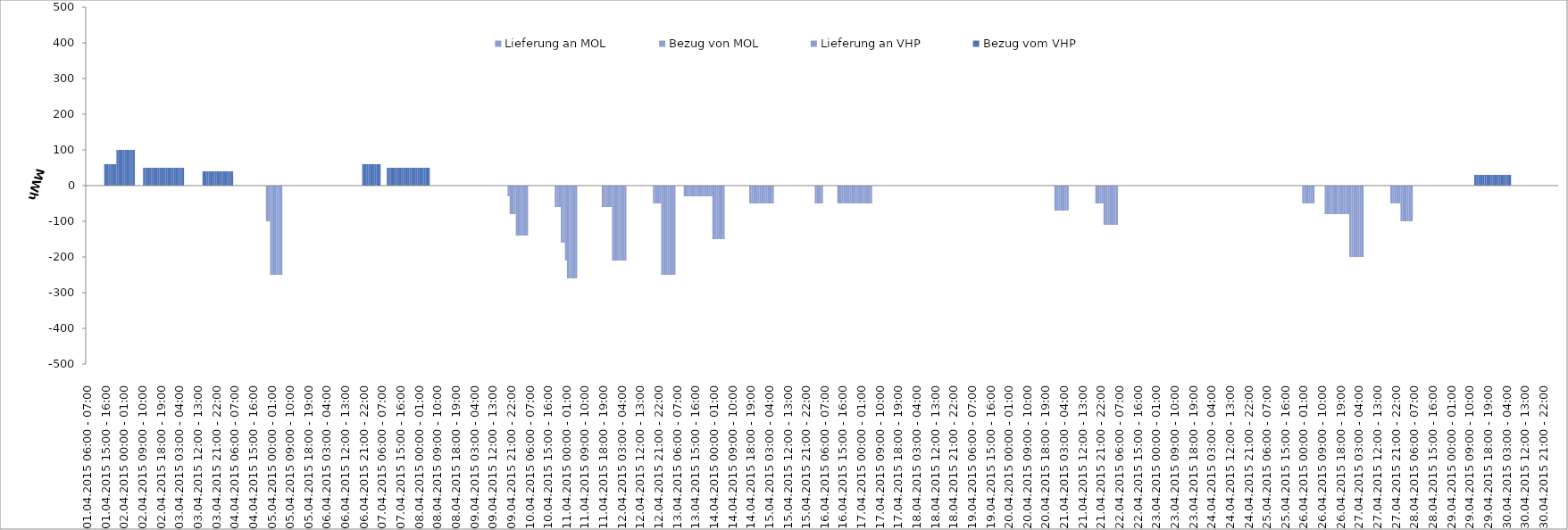
| Category | Bezug vom VHP | Lieferung an VHP | Bezug von MOL | Lieferung an MOL |
|---|---|---|---|---|
| 01.04.2015 06:00 - 07:00 | 0 | 0 | 0 | 0 |
| 01.04.2015 07:00 - 08:00 | 0 | 0 | 0 | 0 |
| 01.04.2015 08:00 - 09:00 | 0 | 0 | 0 | 0 |
| 01.04.2015 09:00 - 10:00 | 0 | 0 | 0 | 0 |
| 01.04.2015 10:00 - 11:00 | 0 | 0 | 0 | 0 |
| 01.04.2015 11:00 - 12:00 | 0 | 0 | 0 | 0 |
| 01.04.2015 12:00 - 13:00 | 0 | 0 | 0 | 0 |
| 01.04.2015 13:00 - 14:00 | 0 | 0 | 0 | 0 |
| 01.04.2015 14:00 - 15:00 | 0 | 0 | 0 | 0 |
| 01.04.2015 15:00 - 16:00 | 60 | 0 | 0 | 0 |
| 01.04.2015 16:00 - 17:00 | 60 | 0 | 0 | 0 |
| 01.04.2015 17:00 - 18:00 | 60 | 0 | 0 | 0 |
| 01.04.2015 18:00 - 19:00 | 60 | 0 | 0 | 0 |
| 01.04.2015 19:00 - 20:00 | 60 | 0 | 0 | 0 |
| 01.04.2015 20:00 - 21:00 | 60 | 0 | 0 | 0 |
| 01.04.2015 21:00 - 22:00 | 100 | 0 | 0 | 0 |
| 01.04.2015 22:00 - 23:00 | 100 | 0 | 0 | 0 |
| 01.04.2015 23:00 - 24:00 | 100 | 0 | 0 | 0 |
| 02.04.2015 00:00 - 01:00 | 100 | 0 | 0 | 0 |
| 02.04.2015 01:00 - 02:00 | 100 | 0 | 0 | 0 |
| 02.04.2015 02:00 - 03:00 | 100 | 0 | 0 | 0 |
| 02.04.2015 03:00 - 04:00 | 100 | 0 | 0 | 0 |
| 02.04.2015 04:00 - 05:00 | 100 | 0 | 0 | 0 |
| 02.04.2015 05:00 - 06:00 | 100 | 0 | 0 | 0 |
| 02.04.2015 06:00 - 07:00 | 0 | 0 | 0 | 0 |
| 02.04.2015 07:00 - 08:00 | 0 | 0 | 0 | 0 |
| 02.04.2015 08:00 - 09:00 | 0 | 0 | 0 | 0 |
| 02.04.2015 09:00 - 10:00 | 0 | 0 | 0 | 0 |
| 02.04.2015 10:00 - 11:00 | 50 | 0 | 0 | 0 |
| 02.04.2015 11:00 - 12:00 | 50 | 0 | 0 | 0 |
| 02.04.2015 12:00 - 13:00 | 50 | 0 | 0 | 0 |
| 02.04.2015 13:00 - 14:00 | 50 | 0 | 0 | 0 |
| 02.04.2015 14:00 - 15:00 | 50 | 0 | 0 | 0 |
| 02.04.2015 15:00 - 16:00 | 50 | 0 | 0 | 0 |
| 02.04.2015 16:00 - 17:00 | 50 | 0 | 0 | 0 |
| 02.04.2015 17:00 - 18:00 | 50 | 0 | 0 | 0 |
| 02.04.2015 18:00 - 19:00 | 50 | 0 | 0 | 0 |
| 02.04.2015 19:00 - 20:00 | 50 | 0 | 0 | 0 |
| 02.04.2015 20:00 - 21:00 | 50 | 0 | 0 | 0 |
| 02.04.2015 21:00 - 22:00 | 50 | 0 | 0 | 0 |
| 02.04.2015 22:00 - 23:00 | 50 | 0 | 0 | 0 |
| 02.04.2015 23:00 - 24:00 | 50 | 0 | 0 | 0 |
| 03.04.2015 00:00 - 01:00 | 50 | 0 | 0 | 0 |
| 03.04.2015 01:00 - 02:00 | 50 | 0 | 0 | 0 |
| 03.04.2015 02:00 - 03:00 | 50 | 0 | 0 | 0 |
| 03.04.2015 03:00 - 04:00 | 50 | 0 | 0 | 0 |
| 03.04.2015 04:00 - 05:00 | 50 | 0 | 0 | 0 |
| 03.04.2015 05:00 - 06:00 | 50 | 0 | 0 | 0 |
| 03.04.2015 06:00 - 07:00 | 0 | 0 | 0 | 0 |
| 03.04.2015 07:00 - 08:00 | 0 | 0 | 0 | 0 |
| 03.04.2015 08:00 - 09:00 | 0 | 0 | 0 | 0 |
| 03.04.2015 09:00 - 10:00 | 0 | 0 | 0 | 0 |
| 03.04.2015 10:00 - 11:00 | 0 | 0 | 0 | 0 |
| 03.04.2015 11:00 - 12:00 | 0 | 0 | 0 | 0 |
| 03.04.2015 12:00 - 13:00 | 0 | 0 | 0 | 0 |
| 03.04.2015 13:00 - 14:00 | 0 | 0 | 0 | 0 |
| 03.04.2015 14:00 - 15:00 | 0 | 0 | 0 | 0 |
| 03.04.2015 15:00 - 16:00 | 40 | 0 | 0 | 0 |
| 03.04.2015 16:00 - 17:00 | 40 | 0 | 0 | 0 |
| 03.04.2015 17:00 - 18:00 | 40 | 0 | 0 | 0 |
| 03.04.2015 18:00 - 19:00 | 40 | 0 | 0 | 0 |
| 03.04.2015 19:00 - 20:00 | 40 | 0 | 0 | 0 |
| 03.04.2015 20:00 - 21:00 | 40 | 0 | 0 | 0 |
| 03.04.2015 21:00 - 22:00 | 40 | 0 | 0 | 0 |
| 03.04.2015 22:00 - 23:00 | 40 | 0 | 0 | 0 |
| 03.04.2015 23:00 - 24:00 | 40 | 0 | 0 | 0 |
| 04.04.2015 00:00 - 01:00 | 40 | 0 | 0 | 0 |
| 04.04.2015 01:00 - 02:00 | 40 | 0 | 0 | 0 |
| 04.04.2015 02:00 - 03:00 | 40 | 0 | 0 | 0 |
| 04.04.2015 03:00 - 04:00 | 40 | 0 | 0 | 0 |
| 04.04.2015 04:00 - 05:00 | 40 | 0 | 0 | 0 |
| 04.04.2015 05:00 - 06:00 | 40 | 0 | 0 | 0 |
| 04.04.2015 06:00 - 07:00 | 0 | 0 | 0 | 0 |
| 04.04.2015 07:00 - 08:00 | 0 | 0 | 0 | 0 |
| 04.04.2015 08:00 - 09:00 | 0 | 0 | 0 | 0 |
| 04.04.2015 09:00 - 10:00 | 0 | 0 | 0 | 0 |
| 04.04.2015 10:00 - 11:00 | 0 | 0 | 0 | 0 |
| 04.04.2015 11:00 - 12:00 | 0 | 0 | 0 | 0 |
| 04.04.2015 12:00 - 13:00 | 0 | 0 | 0 | 0 |
| 04.04.2015 13:00 - 14:00 | 0 | 0 | 0 | 0 |
| 04.04.2015 14:00 - 15:00 | 0 | 0 | 0 | 0 |
| 04.04.2015 15:00 - 16:00 | 0 | 0 | 0 | 0 |
| 04.04.2015 16:00 - 17:00 | 0 | 0 | 0 | 0 |
| 04.04.2015 17:00 - 18:00 | 0 | 0 | 0 | 0 |
| 04.04.2015 18:00 - 19:00 | 0 | 0 | 0 | 0 |
| 04.04.2015 19:00 - 20:00 | 0 | 0 | 0 | 0 |
| 04.04.2015 20:00 - 21:00 | 0 | 0 | 0 | 0 |
| 04.04.2015 21:00 - 22:00 | 0 | 0 | 0 | 0 |
| 04.04.2015 22:00 - 23:00 | 0 | -100 | 0 | 0 |
| 04.04.2015 23:00 - 24:00 | 0 | -100 | 0 | 0 |
| 05.04.2015 00:00 - 01:00 | 0 | -250 | 0 | 0 |
| 05.04.2015 01:00 - 02:00 | 0 | -250 | 0 | 0 |
| 05.04.2015 02:00 - 03:00 | 0 | -250 | 0 | 0 |
| 05.04.2015 03:00 - 04:00 | 0 | -250 | 0 | 0 |
| 05.04.2015 04:00 - 05:00 | 0 | -250 | 0 | 0 |
| 05.04.2015 05:00 - 06:00 | 0 | -250 | 0 | 0 |
| 05.04.2015 06:00 - 07:00 | 0 | 0 | 0 | 0 |
| 05.04.2015 07:00 - 08:00 | 0 | 0 | 0 | 0 |
| 05.04.2015 08:00 - 09:00 | 0 | 0 | 0 | 0 |
| 05.04.2015 09:00 - 10:00 | 0 | 0 | 0 | 0 |
| 05.04.2015 10:00 - 11:00 | 0 | 0 | 0 | 0 |
| 05.04.2015 11:00 - 12:00 | 0 | 0 | 0 | 0 |
| 05.04.2015 12:00 - 13:00 | 0 | 0 | 0 | 0 |
| 05.04.2015 13:00 - 14:00 | 0 | 0 | 0 | 0 |
| 05.04.2015 14:00 - 15:00 | 0 | 0 | 0 | 0 |
| 05.04.2015 15:00 - 16:00 | 0 | 0 | 0 | 0 |
| 05.04.2015 16:00 - 17:00 | 0 | 0 | 0 | 0 |
| 05.04.2015 17:00 - 18:00 | 0 | 0 | 0 | 0 |
| 05.04.2015 18:00 - 19:00 | 0 | 0 | 0 | 0 |
| 05.04.2015 19:00 - 20:00 | 0 | 0 | 0 | 0 |
| 05.04.2015 20:00 - 21:00 | 0 | 0 | 0 | 0 |
| 05.04.2015 21:00 - 22:00 | 0 | 0 | 0 | 0 |
| 05.04.2015 22:00 - 23:00 | 0 | 0 | 0 | 0 |
| 05.04.2015 23:00 - 24:00 | 0 | 0 | 0 | 0 |
| 06.04.2015 00:00 - 01:00 | 0 | 0 | 0 | 0 |
| 06.04.2015 01:00 - 02:00 | 0 | 0 | 0 | 0 |
| 06.04.2015 02:00 - 03:00 | 0 | 0 | 0 | 0 |
| 06.04.2015 03:00 - 04:00 | 0 | 0 | 0 | 0 |
| 06.04.2015 04:00 - 05:00 | 0 | 0 | 0 | 0 |
| 06.04.2015 05:00 - 06:00 | 0 | 0 | 0 | 0 |
| 06.04.2015 06:00 - 07:00 | 0 | 0 | 0 | 0 |
| 06.04.2015 07:00 - 08:00 | 0 | 0 | 0 | 0 |
| 06.04.2015 08:00 - 09:00 | 0 | 0 | 0 | 0 |
| 06.04.2015 09:00 - 10:00 | 0 | 0 | 0 | 0 |
| 06.04.2015 10:00 - 11:00 | 0 | 0 | 0 | 0 |
| 06.04.2015 11:00 - 12:00 | 0 | 0 | 0 | 0 |
| 06.04.2015 12:00 - 13:00 | 0 | 0 | 0 | 0 |
| 06.04.2015 13:00 - 14:00 | 0 | 0 | 0 | 0 |
| 06.04.2015 14:00 - 15:00 | 0 | 0 | 0 | 0 |
| 06.04.2015 15:00 - 16:00 | 0 | 0 | 0 | 0 |
| 06.04.2015 16:00 - 17:00 | 0 | 0 | 0 | 0 |
| 06.04.2015 17:00 - 18:00 | 0 | 0 | 0 | 0 |
| 06.04.2015 18:00 - 19:00 | 0 | 0 | 0 | 0 |
| 06.04.2015 19:00 - 20:00 | 0 | 0 | 0 | 0 |
| 06.04.2015 20:00 - 21:00 | 0 | 0 | 0 | 0 |
| 06.04.2015 21:00 - 22:00 | 60 | 0 | 0 | 0 |
| 06.04.2015 22:00 - 23:00 | 60 | 0 | 0 | 0 |
| 06.04.2015 23:00 - 24:00 | 60 | 0 | 0 | 0 |
| 07.04.2015 00:00 - 01:00 | 60 | 0 | 0 | 0 |
| 07.04.2015 01:00 - 02:00 | 60 | 0 | 0 | 0 |
| 07.04.2015 02:00 - 03:00 | 60 | 0 | 0 | 0 |
| 07.04.2015 03:00 - 04:00 | 60 | 0 | 0 | 0 |
| 07.04.2015 04:00 - 05:00 | 60 | 0 | 0 | 0 |
| 07.04.2015 05:00 - 06:00 | 60 | 0 | 0 | 0 |
| 07.04.2015 06:00 - 07:00 | 0 | 0 | 0 | 0 |
| 07.04.2015 07:00 - 08:00 | 0 | 0 | 0 | 0 |
| 07.04.2015 08:00 - 09:00 | 0 | 0 | 0 | 0 |
| 07.04.2015 09:00 - 10:00 | 50 | 0 | 0 | 0 |
| 07.04.2015 10:00 - 11:00 | 50 | 0 | 0 | 0 |
| 07.04.2015 11:00 - 12:00 | 50 | 0 | 0 | 0 |
| 07.04.2015 12:00 - 13:00 | 50 | 0 | 0 | 0 |
| 07.04.2015 13:00 - 14:00 | 50 | 0 | 0 | 0 |
| 07.04.2015 14:00 - 15:00 | 50 | 0 | 0 | 0 |
| 07.04.2015 15:00 - 16:00 | 50 | 0 | 0 | 0 |
| 07.04.2015 16:00 - 17:00 | 50 | 0 | 0 | 0 |
| 07.04.2015 17:00 - 18:00 | 50 | 0 | 0 | 0 |
| 07.04.2015 18:00 - 19:00 | 50 | 0 | 0 | 0 |
| 07.04.2015 19:00 - 20:00 | 50 | 0 | 0 | 0 |
| 07.04.2015 20:00 - 21:00 | 50 | 0 | 0 | 0 |
| 07.04.2015 21:00 - 22:00 | 50 | 0 | 0 | 0 |
| 07.04.2015 22:00 - 23:00 | 50 | 0 | 0 | 0 |
| 07.04.2015 23:00 - 24:00 | 50 | 0 | 0 | 0 |
| 08.04.2015 00:00 - 01:00 | 50 | 0 | 0 | 0 |
| 08.04.2015 01:00 - 02:00 | 50 | 0 | 0 | 0 |
| 08.04.2015 02:00 - 03:00 | 50 | 0 | 0 | 0 |
| 08.04.2015 03:00 - 04:00 | 50 | 0 | 0 | 0 |
| 08.04.2015 04:00 - 05:00 | 50 | 0 | 0 | 0 |
| 08.04.2015 05:00 - 06:00 | 50 | 0 | 0 | 0 |
| 08.04.2015 06:00 - 07:00 | 0 | 0 | 0 | 0 |
| 08.04.2015 07:00 - 08:00 | 0 | 0 | 0 | 0 |
| 08.04.2015 08:00 - 09:00 | 0 | 0 | 0 | 0 |
| 08.04.2015 09:00 - 10:00 | 0 | 0 | 0 | 0 |
| 08.04.2015 10:00 - 11:00 | 0 | 0 | 0 | 0 |
| 08.04.2015 11:00 - 12:00 | 0 | 0 | 0 | 0 |
| 08.04.2015 12:00 - 13:00 | 0 | 0 | 0 | 0 |
| 08.04.2015 13:00 - 14:00 | 0 | 0 | 0 | 0 |
| 08.04.2015 14:00 - 15:00 | 0 | 0 | 0 | 0 |
| 08.04.2015 15:00 - 16:00 | 0 | 0 | 0 | 0 |
| 08.04.2015 16:00 - 17:00 | 0 | 0 | 0 | 0 |
| 08.04.2015 17:00 - 18:00 | 0 | 0 | 0 | 0 |
| 08.04.2015 18:00 - 19:00 | 0 | 0 | 0 | 0 |
| 08.04.2015 19:00 - 20:00 | 0 | 0 | 0 | 0 |
| 08.04.2015 20:00 - 21:00 | 0 | 0 | 0 | 0 |
| 08.04.2015 21:00 - 22:00 | 0 | 0 | 0 | 0 |
| 08.04.2015 22:00 - 23:00 | 0 | 0 | 0 | 0 |
| 08.04.2015 23:00 - 24:00 | 0 | 0 | 0 | 0 |
| 09.04.2015 00:00 - 01:00 | 0 | 0 | 0 | 0 |
| 09.04.2015 01:00 - 02:00 | 0 | 0 | 0 | 0 |
| 09.04.2015 02:00 - 03:00 | 0 | 0 | 0 | 0 |
| 09.04.2015 03:00 - 04:00 | 0 | 0 | 0 | 0 |
| 09.04.2015 04:00 - 05:00 | 0 | 0 | 0 | 0 |
| 09.04.2015 05:00 - 06:00 | 0 | 0 | 0 | 0 |
| 09.04.2015 06:00 - 07:00 | 0 | 0 | 0 | 0 |
| 09.04.2015 07:00 - 08:00 | 0 | 0 | 0 | 0 |
| 09.04.2015 08:00 - 09:00 | 0 | 0 | 0 | 0 |
| 09.04.2015 09:00 - 10:00 | 0 | 0 | 0 | 0 |
| 09.04.2015 10:00 - 11:00 | 0 | 0 | 0 | 0 |
| 09.04.2015 11:00 - 12:00 | 0 | 0 | 0 | 0 |
| 09.04.2015 12:00 - 13:00 | 0 | 0 | 0 | 0 |
| 09.04.2015 13:00 - 14:00 | 0 | 0 | 0 | 0 |
| 09.04.2015 14:00 - 15:00 | 0 | 0 | 0 | 0 |
| 09.04.2015 15:00 - 16:00 | 0 | 0 | 0 | 0 |
| 09.04.2015 16:00 - 17:00 | 0 | 0 | 0 | 0 |
| 09.04.2015 17:00 - 18:00 | 0 | 0 | 0 | 0 |
| 09.04.2015 18:00 - 19:00 | 0 | 0 | 0 | 0 |
| 09.04.2015 19:00 - 20:00 | 0 | 0 | 0 | 0 |
| 09.04.2015 20:00 - 21:00 | 0 | -30 | 0 | 0 |
| 09.04.2015 21:00 - 22:00 | 0 | -80 | 0 | 0 |
| 09.04.2015 22:00 - 23:00 | 0 | -80 | 0 | 0 |
| 09.04.2015 23:00 - 24:00 | 0 | -80 | 0 | 0 |
| 10.04.2015 00:00 - 01:00 | 0 | -140 | 0 | 0 |
| 10.04.2015 01:00 - 02:00 | 0 | -140 | 0 | 0 |
| 10.04.2015 02:00 - 03:00 | 0 | -140 | 0 | 0 |
| 10.04.2015 03:00 - 04:00 | 0 | -140 | 0 | 0 |
| 10.04.2015 04:00 - 05:00 | 0 | -140 | 0 | 0 |
| 10.04.2015 05:00 - 06:00 | 0 | -140 | 0 | 0 |
| 10.04.2015 06:00 - 07:00 | 0 | 0 | 0 | 0 |
| 10.04.2015 07:00 - 08:00 | 0 | 0 | 0 | 0 |
| 10.04.2015 08:00 - 09:00 | 0 | 0 | 0 | 0 |
| 10.04.2015 09:00 - 10:00 | 0 | 0 | 0 | 0 |
| 10.04.2015 10:00 - 11:00 | 0 | 0 | 0 | 0 |
| 10.04.2015 11:00 - 12:00 | 0 | 0 | 0 | 0 |
| 10.04.2015 12:00 - 13:00 | 0 | 0 | 0 | 0 |
| 10.04.2015 13:00 - 14:00 | 0 | 0 | 0 | 0 |
| 10.04.2015 14:00 - 15:00 | 0 | 0 | 0 | 0 |
| 10.04.2015 15:00 - 16:00 | 0 | 0 | 0 | 0 |
| 10.04.2015 16:00 - 17:00 | 0 | 0 | 0 | 0 |
| 10.04.2015 17:00 - 18:00 | 0 | 0 | 0 | 0 |
| 10.04.2015 18:00 - 19:00 | 0 | 0 | 0 | 0 |
| 10.04.2015 19:00 - 20:00 | 0 | -60 | 0 | 0 |
| 10.04.2015 20:00 - 21:00 | 0 | -60 | 0 | 0 |
| 10.04.2015 21:00 - 22:00 | 0 | -60 | 0 | 0 |
| 10.04.2015 22:00 - 23:00 | 0 | -160 | 0 | 0 |
| 10.04.2015 23:00 - 24:00 | 0 | -160 | 0 | 0 |
| 11.04.2015 00:00 - 01:00 | 0 | -210 | 0 | 0 |
| 11.04.2015 01:00 - 02:00 | 0 | -260 | 0 | 0 |
| 11.04.2015 02:00 - 03:00 | 0 | -260 | 0 | 0 |
| 11.04.2015 03:00 - 04:00 | 0 | -260 | 0 | 0 |
| 11.04.2015 04:00 - 05:00 | 0 | -260 | 0 | 0 |
| 11.04.2015 05:00 - 06:00 | 0 | -260 | 0 | 0 |
| 11.04.2015 06:00 - 07:00 | 0 | 0 | 0 | 0 |
| 11.04.2015 07:00 - 08:00 | 0 | 0 | 0 | 0 |
| 11.04.2015 08:00 - 09:00 | 0 | 0 | 0 | 0 |
| 11.04.2015 09:00 - 10:00 | 0 | 0 | 0 | 0 |
| 11.04.2015 10:00 - 11:00 | 0 | 0 | 0 | 0 |
| 11.04.2015 11:00 - 12:00 | 0 | 0 | 0 | 0 |
| 11.04.2015 12:00 - 13:00 | 0 | 0 | 0 | 0 |
| 11.04.2015 13:00 - 14:00 | 0 | 0 | 0 | 0 |
| 11.04.2015 14:00 - 15:00 | 0 | 0 | 0 | 0 |
| 11.04.2015 15:00 - 16:00 | 0 | 0 | 0 | 0 |
| 11.04.2015 16:00 - 17:00 | 0 | 0 | 0 | 0 |
| 11.04.2015 17:00 - 18:00 | 0 | 0 | 0 | 0 |
| 11.04.2015 18:00 - 19:00 | 0 | -60 | 0 | 0 |
| 11.04.2015 19:00 - 20:00 | 0 | -60 | 0 | 0 |
| 11.04.2015 20:00 - 21:00 | 0 | -60 | 0 | 0 |
| 11.04.2015 21:00 - 22:00 | 0 | -60 | 0 | 0 |
| 11.04.2015 22:00 - 23:00 | 0 | -60 | 0 | 0 |
| 11.04.2015 23:00 - 24:00 | 0 | -210 | 0 | 0 |
| 12.04.2015 00:00 - 01:00 | 0 | -210 | 0 | 0 |
| 12.04.2015 01:00 - 02:00 | 0 | -210 | 0 | 0 |
| 12.04.2015 02:00 - 03:00 | 0 | -210 | 0 | 0 |
| 12.04.2015 03:00 - 04:00 | 0 | -210 | 0 | 0 |
| 12.04.2015 04:00 - 05:00 | 0 | -210 | 0 | 0 |
| 12.04.2015 05:00 - 06:00 | 0 | -210 | 0 | 0 |
| 12.04.2015 06:00 - 07:00 | 0 | 0 | 0 | 0 |
| 12.04.2015 07:00 - 08:00 | 0 | 0 | 0 | 0 |
| 12.04.2015 08:00 - 09:00 | 0 | 0 | 0 | 0 |
| 12.04.2015 09:00 - 10:00 | 0 | 0 | 0 | 0 |
| 12.04.2015 10:00 - 11:00 | 0 | 0 | 0 | 0 |
| 12.04.2015 11:00 - 12:00 | 0 | 0 | 0 | 0 |
| 12.04.2015 12:00 - 13:00 | 0 | 0 | 0 | 0 |
| 12.04.2015 13:00 - 14:00 | 0 | 0 | 0 | 0 |
| 12.04.2015 14:00 - 15:00 | 0 | 0 | 0 | 0 |
| 12.04.2015 15:00 - 16:00 | 0 | 0 | 0 | 0 |
| 12.04.2015 16:00 - 17:00 | 0 | 0 | 0 | 0 |
| 12.04.2015 17:00 - 18:00 | 0 | 0 | 0 | 0 |
| 12.04.2015 18:00 - 19:00 | 0 | 0 | 0 | 0 |
| 12.04.2015 19:00 - 20:00 | 0 | -50 | 0 | 0 |
| 12.04.2015 20:00 - 21:00 | 0 | -50 | 0 | 0 |
| 12.04.2015 21:00 - 22:00 | 0 | -50 | 0 | 0 |
| 12.04.2015 22:00 - 23:00 | 0 | -50 | 0 | 0 |
| 12.04.2015 23:00 - 24:00 | 0 | -250 | 0 | 0 |
| 13.04.2015 00:00 - 01:00 | 0 | -250 | 0 | 0 |
| 13.04.2015 01:00 - 02:00 | 0 | -250 | 0 | 0 |
| 13.04.2015 02:00 - 03:00 | 0 | -250 | 0 | 0 |
| 13.04.2015 03:00 - 04:00 | 0 | -250 | 0 | 0 |
| 13.04.2015 04:00 - 05:00 | 0 | -250 | 0 | 0 |
| 13.04.2015 05:00 - 06:00 | 0 | -250 | 0 | 0 |
| 13.04.2015 06:00 - 07:00 | 0 | 0 | 0 | 0 |
| 13.04.2015 07:00 - 08:00 | 0 | 0 | 0 | 0 |
| 13.04.2015 08:00 - 09:00 | 0 | 0 | 0 | 0 |
| 13.04.2015 09:00 - 10:00 | 0 | 0 | 0 | 0 |
| 13.04.2015 10:00 - 11:00 | 0 | -30 | 0 | 0 |
| 13.04.2015 11:00 - 12:00 | 0 | -30 | 0 | 0 |
| 13.04.2015 12:00 - 13:00 | 0 | -30 | 0 | 0 |
| 13.04.2015 13:00 - 14:00 | 0 | -30 | 0 | 0 |
| 13.04.2015 14:00 - 15:00 | 0 | -30 | 0 | 0 |
| 13.04.2015 15:00 - 16:00 | 0 | -30 | 0 | 0 |
| 13.04.2015 16:00 - 17:00 | 0 | -30 | 0 | 0 |
| 13.04.2015 17:00 - 18:00 | 0 | -30 | 0 | 0 |
| 13.04.2015 18:00 - 19:00 | 0 | -30 | 0 | 0 |
| 13.04.2015 19:00 - 20:00 | 0 | -30 | 0 | 0 |
| 13.04.2015 20:00 - 21:00 | 0 | -30 | 0 | 0 |
| 13.04.2015 21:00 - 22:00 | 0 | -30 | 0 | 0 |
| 13.04.2015 22:00 - 23:00 | 0 | -30 | 0 | 0 |
| 13.04.2015 23:00 - 24:00 | 0 | -30 | 0 | 0 |
| 14.04.2015 00:00 - 01:00 | 0 | -150 | 0 | 0 |
| 14.04.2015 01:00 - 02:00 | 0 | -150 | 0 | 0 |
| 14.04.2015 02:00 - 03:00 | 0 | -150 | 0 | 0 |
| 14.04.2015 03:00 - 04:00 | 0 | -150 | 0 | 0 |
| 14.04.2015 04:00 - 05:00 | 0 | -150 | 0 | 0 |
| 14.04.2015 05:00 - 06:00 | 0 | -150 | 0 | 0 |
| 14.04.2015 06:00 - 07:00 | 0 | 0 | 0 | 0 |
| 14.04.2015 07:00 - 08:00 | 0 | 0 | 0 | 0 |
| 14.04.2015 08:00 - 09:00 | 0 | 0 | 0 | 0 |
| 14.04.2015 09:00 - 10:00 | 0 | 0 | 0 | 0 |
| 14.04.2015 10:00 - 11:00 | 0 | 0 | 0 | 0 |
| 14.04.2015 11:00 - 12:00 | 0 | 0 | 0 | 0 |
| 14.04.2015 12:00 - 13:00 | 0 | 0 | 0 | 0 |
| 14.04.2015 13:00 - 14:00 | 0 | 0 | 0 | 0 |
| 14.04.2015 14:00 - 15:00 | 0 | 0 | 0 | 0 |
| 14.04.2015 15:00 - 16:00 | 0 | 0 | 0 | 0 |
| 14.04.2015 16:00 - 17:00 | 0 | 0 | 0 | 0 |
| 14.04.2015 17:00 - 18:00 | 0 | 0 | 0 | 0 |
| 14.04.2015 18:00 - 19:00 | 0 | -50 | 0 | 0 |
| 14.04.2015 19:00 - 20:00 | 0 | -50 | 0 | 0 |
| 14.04.2015 20:00 - 21:00 | 0 | -50 | 0 | 0 |
| 14.04.2015 21:00 - 22:00 | 0 | -50 | 0 | 0 |
| 14.04.2015 22:00 - 23:00 | 0 | -50 | 0 | 0 |
| 14.04.2015 23:00 - 24:00 | 0 | -50 | 0 | 0 |
| 15.04.2015 00:00 - 01:00 | 0 | -50 | 0 | 0 |
| 15.04.2015 01:00 - 02:00 | 0 | -50 | 0 | 0 |
| 15.04.2015 02:00 - 03:00 | 0 | -50 | 0 | 0 |
| 15.04.2015 03:00 - 04:00 | 0 | -50 | 0 | 0 |
| 15.04.2015 04:00 - 05:00 | 0 | -50 | 0 | 0 |
| 15.04.2015 05:00 - 06:00 | 0 | -50 | 0 | 0 |
| 15.04.2015 06:00 - 07:00 | 0 | 0 | 0 | 0 |
| 15.04.2015 07:00 - 08:00 | 0 | 0 | 0 | 0 |
| 15.04.2015 08:00 - 09:00 | 0 | 0 | 0 | 0 |
| 15.04.2015 09:00 - 10:00 | 0 | 0 | 0 | 0 |
| 15.04.2015 10:00 - 11:00 | 0 | 0 | 0 | 0 |
| 15.04.2015 11:00 - 12:00 | 0 | 0 | 0 | 0 |
| 15.04.2015 12:00 - 13:00 | 0 | 0 | 0 | 0 |
| 15.04.2015 13:00 - 14:00 | 0 | 0 | 0 | 0 |
| 15.04.2015 14:00 - 15:00 | 0 | 0 | 0 | 0 |
| 15.04.2015 15:00 - 16:00 | 0 | 0 | 0 | 0 |
| 15.04.2015 16:00 - 17:00 | 0 | 0 | 0 | 0 |
| 15.04.2015 17:00 - 18:00 | 0 | 0 | 0 | 0 |
| 15.04.2015 18:00 - 19:00 | 0 | 0 | 0 | 0 |
| 15.04.2015 19:00 - 20:00 | 0 | 0 | 0 | 0 |
| 15.04.2015 20:00 - 21:00 | 0 | 0 | 0 | 0 |
| 15.04.2015 21:00 - 22:00 | 0 | 0 | 0 | 0 |
| 15.04.2015 22:00 - 23:00 | 0 | 0 | 0 | 0 |
| 15.04.2015 23:00 - 24:00 | 0 | 0 | 0 | 0 |
| 16.04.2015 00:00 - 01:00 | 0 | 0 | 0 | 0 |
| 16.04.2015 01:00 - 02:00 | 0 | 0 | 0 | 0 |
| 16.04.2015 02:00 - 03:00 | 0 | -50 | 0 | 0 |
| 16.04.2015 03:00 - 04:00 | 0 | -50 | 0 | 0 |
| 16.04.2015 04:00 - 05:00 | 0 | -50 | 0 | 0 |
| 16.04.2015 05:00 - 06:00 | 0 | -50 | 0 | 0 |
| 16.04.2015 06:00 - 07:00 | 0 | 0 | 0 | 0 |
| 16.04.2015 07:00 - 08:00 | 0 | 0 | 0 | 0 |
| 16.04.2015 08:00 - 09:00 | 0 | 0 | 0 | 0 |
| 16.04.2015 09:00 - 10:00 | 0 | 0 | 0 | 0 |
| 16.04.2015 10:00 - 11:00 | 0 | 0 | 0 | 0 |
| 16.04.2015 11:00 - 12:00 | 0 | 0 | 0 | 0 |
| 16.04.2015 12:00 - 13:00 | 0 | 0 | 0 | 0 |
| 16.04.2015 13:00 - 14:00 | 0 | -50 | 0 | 0 |
| 16.04.2015 14:00 - 15:00 | 0 | -50 | 0 | 0 |
| 16.04.2015 15:00 - 16:00 | 0 | -50 | 0 | 0 |
| 16.04.2015 16:00 - 17:00 | 0 | -50 | 0 | 0 |
| 16.04.2015 17:00 - 18:00 | 0 | -50 | 0 | 0 |
| 16.04.2015 18:00 - 19:00 | 0 | -50 | 0 | 0 |
| 16.04.2015 19:00 - 20:00 | 0 | -50 | 0 | 0 |
| 16.04.2015 20:00 - 21:00 | 0 | -50 | 0 | 0 |
| 16.04.2015 21:00 - 22:00 | 0 | -50 | 0 | 0 |
| 16.04.2015 22:00 - 23:00 | 0 | -50 | 0 | 0 |
| 16.04.2015 23:00 - 24:00 | 0 | -50 | 0 | 0 |
| 17.04.2015 00:00 - 01:00 | 0 | -50 | 0 | 0 |
| 17.04.2015 01:00 - 02:00 | 0 | -50 | 0 | 0 |
| 17.04.2015 02:00 - 03:00 | 0 | -50 | 0 | 0 |
| 17.04.2015 03:00 - 04:00 | 0 | -50 | 0 | 0 |
| 17.04.2015 04:00 - 05:00 | 0 | -50 | 0 | 0 |
| 17.04.2015 05:00 - 06:00 | 0 | -50 | 0 | 0 |
| 17.04.2015 06:00 - 07:00 | 0 | 0 | 0 | 0 |
| 17.04.2015 07:00 - 08:00 | 0 | 0 | 0 | 0 |
| 17.04.2015 08:00 - 09:00 | 0 | 0 | 0 | 0 |
| 17.04.2015 09:00 - 10:00 | 0 | 0 | 0 | 0 |
| 17.04.2015 10:00 - 11:00 | 0 | 0 | 0 | 0 |
| 17.04.2015 11:00 - 12:00 | 0 | 0 | 0 | 0 |
| 17.04.2015 12:00 - 13:00 | 0 | 0 | 0 | 0 |
| 17.04.2015 13:00 - 14:00 | 0 | 0 | 0 | 0 |
| 17.04.2015 14:00 - 15:00 | 0 | 0 | 0 | 0 |
| 17.04.2015 15:00 - 16:00 | 0 | 0 | 0 | 0 |
| 17.04.2015 16:00 - 17:00 | 0 | 0 | 0 | 0 |
| 17.04.2015 17:00 - 18:00 | 0 | 0 | 0 | 0 |
| 17.04.2015 18:00 - 19:00 | 0 | 0 | 0 | 0 |
| 17.04.2015 19:00 - 20:00 | 0 | 0 | 0 | 0 |
| 17.04.2015 20:00 - 21:00 | 0 | 0 | 0 | 0 |
| 17.04.2015 21:00 - 22:00 | 0 | 0 | 0 | 0 |
| 17.04.2015 22:00 - 23:00 | 0 | 0 | 0 | 0 |
| 17.04.2015 23:00 - 24:00 | 0 | 0 | 0 | 0 |
| 18.04.2015 00:00 - 01:00 | 0 | 0 | 0 | 0 |
| 18.04.2015 01:00 - 02:00 | 0 | 0 | 0 | 0 |
| 18.04.2015 02:00 - 03:00 | 0 | 0 | 0 | 0 |
| 18.04.2015 03:00 - 04:00 | 0 | 0 | 0 | 0 |
| 18.04.2015 04:00 - 05:00 | 0 | 0 | 0 | 0 |
| 18.04.2015 05:00 - 06:00 | 0 | 0 | 0 | 0 |
| 18.04.2015 06:00 - 07:00 | 0 | 0 | 0 | 0 |
| 18.04.2015 07:00 - 08:00 | 0 | 0 | 0 | 0 |
| 18.04.2015 08:00 - 09:00 | 0 | 0 | 0 | 0 |
| 18.04.2015 09:00 - 10:00 | 0 | 0 | 0 | 0 |
| 18.04.2015 10:00 - 11:00 | 0 | 0 | 0 | 0 |
| 18.04.2015 11:00 - 12:00 | 0 | 0 | 0 | 0 |
| 18.04.2015 12:00 - 13:00 | 0 | 0 | 0 | 0 |
| 18.04.2015 13:00 - 14:00 | 0 | 0 | 0 | 0 |
| 18.04.2015 14:00 - 15:00 | 0 | 0 | 0 | 0 |
| 18.04.2015 15:00 - 16:00 | 0 | 0 | 0 | 0 |
| 18.04.2015 16:00 - 17:00 | 0 | 0 | 0 | 0 |
| 18.04.2015 17:00 - 18:00 | 0 | 0 | 0 | 0 |
| 18.04.2015 18:00 - 19:00 | 0 | 0 | 0 | 0 |
| 18.04.2015 19:00 - 20:00 | 0 | 0 | 0 | 0 |
| 18.04.2015 20:00 - 21:00 | 0 | 0 | 0 | 0 |
| 18.04.2015 21:00 - 22:00 | 0 | 0 | 0 | 0 |
| 18.04.2015 22:00 - 23:00 | 0 | 0 | 0 | 0 |
| 18.04.2015 23:00 - 24:00 | 0 | 0 | 0 | 0 |
| 19.04.2015 00:00 - 01:00 | 0 | 0 | 0 | 0 |
| 19.04.2015 01:00 - 02:00 | 0 | 0 | 0 | 0 |
| 19.04.2015 02:00 - 03:00 | 0 | 0 | 0 | 0 |
| 19.04.2015 03:00 - 04:00 | 0 | 0 | 0 | 0 |
| 19.04.2015 04:00 - 05:00 | 0 | 0 | 0 | 0 |
| 19.04.2015 05:00 - 06:00 | 0 | 0 | 0 | 0 |
| 19.04.2015 06:00 - 07:00 | 0 | 0 | 0 | 0 |
| 19.04.2015 07:00 - 08:00 | 0 | 0 | 0 | 0 |
| 19.04.2015 08:00 - 09:00 | 0 | 0 | 0 | 0 |
| 19.04.2015 09:00 - 10:00 | 0 | 0 | 0 | 0 |
| 19.04.2015 10:00 - 11:00 | 0 | 0 | 0 | 0 |
| 19.04.2015 11:00 - 12:00 | 0 | 0 | 0 | 0 |
| 19.04.2015 12:00 - 13:00 | 0 | 0 | 0 | 0 |
| 19.04.2015 13:00 - 14:00 | 0 | 0 | 0 | 0 |
| 19.04.2015 14:00 - 15:00 | 0 | 0 | 0 | 0 |
| 19.04.2015 15:00 - 16:00 | 0 | 0 | 0 | 0 |
| 19.04.2015 16:00 - 17:00 | 0 | 0 | 0 | 0 |
| 19.04.2015 17:00 - 18:00 | 0 | 0 | 0 | 0 |
| 19.04.2015 18:00 - 19:00 | 0 | 0 | 0 | 0 |
| 19.04.2015 19:00 - 20:00 | 0 | 0 | 0 | 0 |
| 19.04.2015 20:00 - 21:00 | 0 | 0 | 0 | 0 |
| 19.04.2015 21:00 - 22:00 | 0 | 0 | 0 | 0 |
| 19.04.2015 22:00 - 23:00 | 0 | 0 | 0 | 0 |
| 19.04.2015 23:00 - 24:00 | 0 | 0 | 0 | 0 |
| 20.04.2015 00:00 - 01:00 | 0 | 0 | 0 | 0 |
| 20.04.2015 01:00 - 02:00 | 0 | 0 | 0 | 0 |
| 20.04.2015 02:00 - 03:00 | 0 | 0 | 0 | 0 |
| 20.04.2015 03:00 - 04:00 | 0 | 0 | 0 | 0 |
| 20.04.2015 04:00 - 05:00 | 0 | 0 | 0 | 0 |
| 20.04.2015 05:00 - 06:00 | 0 | 0 | 0 | 0 |
| 20.04.2015 06:00 - 07:00 | 0 | 0 | 0 | 0 |
| 20.04.2015 07:00 - 08:00 | 0 | 0 | 0 | 0 |
| 20.04.2015 08:00 - 09:00 | 0 | 0 | 0 | 0 |
| 20.04.2015 09:00 - 10:00 | 0 | 0 | 0 | 0 |
| 20.04.2015 10:00 - 11:00 | 0 | 0 | 0 | 0 |
| 20.04.2015 11:00 - 12:00 | 0 | 0 | 0 | 0 |
| 20.04.2015 12:00 - 13:00 | 0 | 0 | 0 | 0 |
| 20.04.2015 13:00 - 14:00 | 0 | 0 | 0 | 0 |
| 20.04.2015 14:00 - 15:00 | 0 | 0 | 0 | 0 |
| 20.04.2015 15:00 - 16:00 | 0 | 0 | 0 | 0 |
| 20.04.2015 16:00 - 17:00 | 0 | 0 | 0 | 0 |
| 20.04.2015 17:00 - 18:00 | 0 | 0 | 0 | 0 |
| 20.04.2015 18:00 - 19:00 | 0 | 0 | 0 | 0 |
| 20.04.2015 19:00 - 20:00 | 0 | 0 | 0 | 0 |
| 20.04.2015 20:00 - 21:00 | 0 | 0 | 0 | 0 |
| 20.04.2015 21:00 - 22:00 | 0 | 0 | 0 | 0 |
| 20.04.2015 22:00 - 23:00 | 0 | 0 | 0 | 0 |
| 20.04.2015 23:00 - 24:00 | 0 | -70 | 0 | 0 |
| 21.04.2015 00:00 - 01:00 | 0 | -70 | 0 | 0 |
| 21.04.2015 01:00 - 02:00 | 0 | -70 | 0 | 0 |
| 21.04.2015 02:00 - 03:00 | 0 | -70 | 0 | 0 |
| 21.04.2015 03:00 - 04:00 | 0 | -70 | 0 | 0 |
| 21.04.2015 04:00 - 05:00 | 0 | -70 | 0 | 0 |
| 21.04.2015 05:00 - 06:00 | 0 | -70 | 0 | 0 |
| 21.04.2015 06:00 - 07:00 | 0 | 0 | 0 | 0 |
| 21.04.2015 07:00 - 08:00 | 0 | 0 | 0 | 0 |
| 21.04.2015 08:00 - 09:00 | 0 | 0 | 0 | 0 |
| 21.04.2015 09:00 - 10:00 | 0 | 0 | 0 | 0 |
| 21.04.2015 10:00 - 11:00 | 0 | 0 | 0 | 0 |
| 21.04.2015 11:00 - 12:00 | 0 | 0 | 0 | 0 |
| 21.04.2015 12:00 - 13:00 | 0 | 0 | 0 | 0 |
| 21.04.2015 13:00 - 14:00 | 0 | 0 | 0 | 0 |
| 21.04.2015 14:00 - 15:00 | 0 | 0 | 0 | 0 |
| 21.04.2015 15:00 - 16:00 | 0 | 0 | 0 | 0 |
| 21.04.2015 16:00 - 17:00 | 0 | 0 | 0 | 0 |
| 21.04.2015 17:00 - 18:00 | 0 | 0 | 0 | 0 |
| 21.04.2015 18:00 - 19:00 | 0 | 0 | 0 | 0 |
| 21.04.2015 19:00 - 20:00 | 0 | -50 | 0 | 0 |
| 21.04.2015 20:00 - 21:00 | 0 | -50 | 0 | 0 |
| 21.04.2015 21:00 - 22:00 | 0 | -50 | 0 | 0 |
| 21.04.2015 22:00 - 23:00 | 0 | -50 | 0 | 0 |
| 21.04.2015 23:00 - 24:00 | 0 | -110 | 0 | 0 |
| 22.04.2015 00:00 - 01:00 | 0 | -110 | 0 | 0 |
| 22.04.2015 01:00 - 02:00 | 0 | -110 | 0 | 0 |
| 22.04.2015 02:00 - 03:00 | 0 | -110 | 0 | 0 |
| 22.04.2015 03:00 - 04:00 | 0 | -110 | 0 | 0 |
| 22.04.2015 04:00 - 05:00 | 0 | -110 | 0 | 0 |
| 22.04.2015 05:00 - 06:00 | 0 | -110 | 0 | 0 |
| 22.04.2015 06:00 - 07:00 | 0 | 0 | 0 | 0 |
| 22.04.2015 07:00 - 08:00 | 0 | 0 | 0 | 0 |
| 22.04.2015 08:00 - 09:00 | 0 | 0 | 0 | 0 |
| 22.04.2015 09:00 - 10:00 | 0 | 0 | 0 | 0 |
| 22.04.2015 10:00 - 11:00 | 0 | 0 | 0 | 0 |
| 22.04.2015 11:00 - 12:00 | 0 | 0 | 0 | 0 |
| 22.04.2015 12:00 - 13:00 | 0 | 0 | 0 | 0 |
| 22.04.2015 13:00 - 14:00 | 0 | 0 | 0 | 0 |
| 22.04.2015 14:00 - 15:00 | 0 | 0 | 0 | 0 |
| 22.04.2015 15:00 - 16:00 | 0 | 0 | 0 | 0 |
| 22.04.2015 16:00 - 17:00 | 0 | 0 | 0 | 0 |
| 22.04.2015 17:00 - 18:00 | 0 | 0 | 0 | 0 |
| 22.04.2015 18:00 - 19:00 | 0 | 0 | 0 | 0 |
| 22.04.2015 19:00 - 20:00 | 0 | 0 | 0 | 0 |
| 22.04.2015 20:00 - 21:00 | 0 | 0 | 0 | 0 |
| 22.04.2015 21:00 - 22:00 | 0 | 0 | 0 | 0 |
| 22.04.2015 22:00 - 23:00 | 0 | 0 | 0 | 0 |
| 22.04.2015 23:00 - 24:00 | 0 | 0 | 0 | 0 |
| 23.04.2015 00:00 - 01:00 | 0 | 0 | 0 | 0 |
| 23.04.2015 01:00 - 02:00 | 0 | 0 | 0 | 0 |
| 23.04.2015 02:00 - 03:00 | 0 | 0 | 0 | 0 |
| 23.04.2015 03:00 - 04:00 | 0 | 0 | 0 | 0 |
| 23.04.2015 04:00 - 05:00 | 0 | 0 | 0 | 0 |
| 23.04.2015 05:00 - 06:00 | 0 | 0 | 0 | 0 |
| 23.04.2015 06:00 - 07:00 | 0 | 0 | 0 | 0 |
| 23.04.2015 07:00 - 08:00 | 0 | 0 | 0 | 0 |
| 23.04.2015 08:00 - 09:00 | 0 | 0 | 0 | 0 |
| 23.04.2015 09:00 - 10:00 | 0 | 0 | 0 | 0 |
| 23.04.2015 10:00 - 11:00 | 0 | 0 | 0 | 0 |
| 23.04.2015 11:00 - 12:00 | 0 | 0 | 0 | 0 |
| 23.04.2015 12:00 - 13:00 | 0 | 0 | 0 | 0 |
| 23.04.2015 13:00 - 14:00 | 0 | 0 | 0 | 0 |
| 23.04.2015 14:00 - 15:00 | 0 | 0 | 0 | 0 |
| 23.04.2015 15:00 - 16:00 | 0 | 0 | 0 | 0 |
| 23.04.2015 16:00 - 17:00 | 0 | 0 | 0 | 0 |
| 23.04.2015 17:00 - 18:00 | 0 | 0 | 0 | 0 |
| 23.04.2015 18:00 - 19:00 | 0 | 0 | 0 | 0 |
| 23.04.2015 19:00 - 20:00 | 0 | 0 | 0 | 0 |
| 23.04.2015 20:00 - 21:00 | 0 | 0 | 0 | 0 |
| 23.04.2015 21:00 - 22:00 | 0 | 0 | 0 | 0 |
| 23.04.2015 22:00 - 23:00 | 0 | 0 | 0 | 0 |
| 23.04.2015 23:00 - 24:00 | 0 | 0 | 0 | 0 |
| 24.04.2015 00:00 - 01:00 | 0 | 0 | 0 | 0 |
| 24.04.2015 01:00 - 02:00 | 0 | 0 | 0 | 0 |
| 24.04.2015 02:00 - 03:00 | 0 | 0 | 0 | 0 |
| 24.04.2015 03:00 - 04:00 | 0 | 0 | 0 | 0 |
| 24.04.2015 04:00 - 05:00 | 0 | 0 | 0 | 0 |
| 24.04.2015 05:00 - 06:00 | 0 | 0 | 0 | 0 |
| 24.04.2015 06:00 - 07:00 | 0 | 0 | 0 | 0 |
| 24.04.2015 07:00 - 08:00 | 0 | 0 | 0 | 0 |
| 24.04.2015 08:00 - 09:00 | 0 | 0 | 0 | 0 |
| 24.04.2015 09:00 - 10:00 | 0 | 0 | 0 | 0 |
| 24.04.2015 10:00 - 11:00 | 0 | 0 | 0 | 0 |
| 24.04.2015 11:00 - 12:00 | 0 | 0 | 0 | 0 |
| 24.04.2015 12:00 - 13:00 | 0 | 0 | 0 | 0 |
| 24.04.2015 13:00 - 14:00 | 0 | 0 | 0 | 0 |
| 24.04.2015 14:00 - 15:00 | 0 | 0 | 0 | 0 |
| 24.04.2015 15:00 - 16:00 | 0 | 0 | 0 | 0 |
| 24.04.2015 16:00 - 17:00 | 0 | 0 | 0 | 0 |
| 24.04.2015 17:00 - 18:00 | 0 | 0 | 0 | 0 |
| 24.04.2015 18:00 - 19:00 | 0 | 0 | 0 | 0 |
| 24.04.2015 19:00 - 20:00 | 0 | 0 | 0 | 0 |
| 24.04.2015 20:00 - 21:00 | 0 | 0 | 0 | 0 |
| 24.04.2015 21:00 - 22:00 | 0 | 0 | 0 | 0 |
| 24.04.2015 22:00 - 23:00 | 0 | 0 | 0 | 0 |
| 24.04.2015 23:00 - 24:00 | 0 | 0 | 0 | 0 |
| 25.04.2015 00:00 - 01:00 | 0 | 0 | 0 | 0 |
| 25.04.2015 01:00 - 02:00 | 0 | 0 | 0 | 0 |
| 25.04.2015 02:00 - 03:00 | 0 | 0 | 0 | 0 |
| 25.04.2015 03:00 - 04:00 | 0 | 0 | 0 | 0 |
| 25.04.2015 04:00 - 05:00 | 0 | 0 | 0 | 0 |
| 25.04.2015 05:00 - 06:00 | 0 | 0 | 0 | 0 |
| 25.04.2015 06:00 - 07:00 | 0 | 0 | 0 | 0 |
| 25.04.2015 07:00 - 08:00 | 0 | 0 | 0 | 0 |
| 25.04.2015 08:00 - 09:00 | 0 | 0 | 0 | 0 |
| 25.04.2015 09:00 - 10:00 | 0 | 0 | 0 | 0 |
| 25.04.2015 10:00 - 11:00 | 0 | 0 | 0 | 0 |
| 25.04.2015 11:00 - 12:00 | 0 | 0 | 0 | 0 |
| 25.04.2015 12:00 - 13:00 | 0 | 0 | 0 | 0 |
| 25.04.2015 13:00 - 14:00 | 0 | 0 | 0 | 0 |
| 25.04.2015 14:00 - 15:00 | 0 | 0 | 0 | 0 |
| 25.04.2015 15:00 - 16:00 | 0 | 0 | 0 | 0 |
| 25.04.2015 16:00 - 17:00 | 0 | 0 | 0 | 0 |
| 25.04.2015 17:00 - 18:00 | 0 | 0 | 0 | 0 |
| 25.04.2015 18:00 - 19:00 | 0 | 0 | 0 | 0 |
| 25.04.2015 19:00 - 20:00 | 0 | 0 | 0 | 0 |
| 25.04.2015 20:00 - 21:00 | 0 | 0 | 0 | 0 |
| 25.04.2015 21:00 - 22:00 | 0 | 0 | 0 | 0 |
| 25.04.2015 22:00 - 23:00 | 0 | 0 | 0 | 0 |
| 25.04.2015 23:00 - 24:00 | 0 | 0 | 0 | 0 |
| 26.04.2015 00:00 - 01:00 | 0 | -50 | 0 | 0 |
| 26.04.2015 01:00 - 02:00 | 0 | -50 | 0 | 0 |
| 26.04.2015 02:00 - 03:00 | 0 | -50 | 0 | 0 |
| 26.04.2015 03:00 - 04:00 | 0 | -50 | 0 | 0 |
| 26.04.2015 04:00 - 05:00 | 0 | -50 | 0 | 0 |
| 26.04.2015 05:00 - 06:00 | 0 | -50 | 0 | 0 |
| 26.04.2015 06:00 - 07:00 | 0 | 0 | 0 | 0 |
| 26.04.2015 07:00 - 08:00 | 0 | 0 | 0 | 0 |
| 26.04.2015 08:00 - 09:00 | 0 | 0 | 0 | 0 |
| 26.04.2015 09:00 - 10:00 | 0 | 0 | 0 | 0 |
| 26.04.2015 10:00 - 11:00 | 0 | 0 | 0 | 0 |
| 26.04.2015 11:00 - 12:00 | 0 | -80 | 0 | 0 |
| 26.04.2015 12:00 - 13:00 | 0 | -80 | 0 | 0 |
| 26.04.2015 13:00 - 14:00 | 0 | -80 | 0 | 0 |
| 26.04.2015 14:00 - 15:00 | 0 | -80 | 0 | 0 |
| 26.04.2015 15:00 - 16:00 | 0 | -80 | 0 | 0 |
| 26.04.2015 16:00 - 17:00 | 0 | -80 | 0 | 0 |
| 26.04.2015 17:00 - 18:00 | 0 | -80 | 0 | 0 |
| 26.04.2015 18:00 - 19:00 | 0 | -80 | 0 | 0 |
| 26.04.2015 19:00 - 20:00 | 0 | -80 | 0 | 0 |
| 26.04.2015 20:00 - 21:00 | 0 | -80 | 0 | 0 |
| 26.04.2015 21:00 - 22:00 | 0 | -80 | 0 | 0 |
| 26.04.2015 22:00 - 23:00 | 0 | -80 | 0 | 0 |
| 26.04.2015 23:00 - 24:00 | 0 | -200 | 0 | 0 |
| 27.04.2015 00:00 - 01:00 | 0 | -200 | 0 | 0 |
| 27.04.2015 01:00 - 02:00 | 0 | -200 | 0 | 0 |
| 27.04.2015 02:00 - 03:00 | 0 | -200 | 0 | 0 |
| 27.04.2015 03:00 - 04:00 | 0 | -200 | 0 | 0 |
| 27.04.2015 04:00 - 05:00 | 0 | -200 | 0 | 0 |
| 27.04.2015 05:00 - 06:00 | 0 | -200 | 0 | 0 |
| 27.04.2015 06:00 - 07:00 | 0 | 0 | 0 | 0 |
| 27.04.2015 07:00 - 08:00 | 0 | 0 | 0 | 0 |
| 27.04.2015 08:00 - 09:00 | 0 | 0 | 0 | 0 |
| 27.04.2015 09:00 - 10:00 | 0 | 0 | 0 | 0 |
| 27.04.2015 10:00 - 11:00 | 0 | 0 | 0 | 0 |
| 27.04.2015 11:00 - 12:00 | 0 | 0 | 0 | 0 |
| 27.04.2015 12:00 - 13:00 | 0 | 0 | 0 | 0 |
| 27.04.2015 13:00 - 14:00 | 0 | 0 | 0 | 0 |
| 27.04.2015 14:00 - 15:00 | 0 | 0 | 0 | 0 |
| 27.04.2015 15:00 - 16:00 | 0 | 0 | 0 | 0 |
| 27.04.2015 16:00 - 17:00 | 0 | 0 | 0 | 0 |
| 27.04.2015 17:00 - 18:00 | 0 | 0 | 0 | 0 |
| 27.04.2015 18:00 - 19:00 | 0 | 0 | 0 | 0 |
| 27.04.2015 19:00 - 20:00 | 0 | -50 | 0 | 0 |
| 27.04.2015 20:00 - 21:00 | 0 | -50 | 0 | 0 |
| 27.04.2015 21:00 - 22:00 | 0 | -50 | 0 | 0 |
| 27.04.2015 22:00 - 23:00 | 0 | -50 | 0 | 0 |
| 27.04.2015 23:00 - 24:00 | 0 | -50 | 0 | 0 |
| 28.04.2015 00:00 - 01:00 | 0 | -100 | 0 | 0 |
| 28.04.2015 01:00 - 02:00 | 0 | -100 | 0 | 0 |
| 28.04.2015 02:00 - 03:00 | 0 | -100 | 0 | 0 |
| 28.04.2015 03:00 - 04:00 | 0 | -100 | 0 | 0 |
| 28.04.2015 04:00 - 05:00 | 0 | -100 | 0 | 0 |
| 28.04.2015 05:00 - 06:00 | 0 | -100 | 0 | 0 |
| 28.04.2015 06:00 - 07:00 | 0 | 0 | 0 | 0 |
| 28.04.2015 07:00 - 08:00 | 0 | 0 | 0 | 0 |
| 28.04.2015 08:00 - 09:00 | 0 | 0 | 0 | 0 |
| 28.04.2015 09:00 - 10:00 | 0 | 0 | 0 | 0 |
| 28.04.2015 10:00 - 11:00 | 0 | 0 | 0 | 0 |
| 28.04.2015 11:00 - 12:00 | 0 | 0 | 0 | 0 |
| 28.04.2015 12:00 - 13:00 | 0 | 0 | 0 | 0 |
| 28.04.2015 13:00 - 14:00 | 0 | 0 | 0 | 0 |
| 28.04.2015 14:00 - 15:00 | 0 | 0 | 0 | 0 |
| 28.04.2015 15:00 - 16:00 | 0 | 0 | 0 | 0 |
| 28.04.2015 16:00 - 17:00 | 0 | 0 | 0 | 0 |
| 28.04.2015 17:00 - 18:00 | 0 | 0 | 0 | 0 |
| 28.04.2015 18:00 - 19:00 | 0 | 0 | 0 | 0 |
| 28.04.2015 19:00 - 20:00 | 0 | 0 | 0 | 0 |
| 28.04.2015 20:00 - 21:00 | 0 | 0 | 0 | 0 |
| 28.04.2015 21:00 - 22:00 | 0 | 0 | 0 | 0 |
| 28.04.2015 22:00 - 23:00 | 0 | 0 | 0 | 0 |
| 28.04.2015 23:00 - 24:00 | 0 | 0 | 0 | 0 |
| 29.04.2015 00:00 - 01:00 | 0 | 0 | 0 | 0 |
| 29.04.2015 01:00 - 02:00 | 0 | 0 | 0 | 0 |
| 29.04.2015 02:00 - 03:00 | 0 | 0 | 0 | 0 |
| 29.04.2015 03:00 - 04:00 | 0 | 0 | 0 | 0 |
| 29.04.2015 04:00 - 05:00 | 0 | 0 | 0 | 0 |
| 29.04.2015 05:00 - 06:00 | 0 | 0 | 0 | 0 |
| 29.04.2015 06:00 - 07:00 | 0 | 0 | 0 | 0 |
| 29.04.2015 07:00 - 08:00 | 0 | 0 | 0 | 0 |
| 29.04.2015 08:00 - 09:00 | 0 | 0 | 0 | 0 |
| 29.04.2015 09:00 - 10:00 | 0 | 0 | 0 | 0 |
| 29.04.2015 10:00 - 11:00 | 0 | 0 | 0 | 0 |
| 29.04.2015 11:00 - 12:00 | 0 | 0 | 0 | 0 |
| 29.04.2015 12:00 - 13:00 | 30 | 0 | 0 | 0 |
| 29.04.2015 13:00 - 14:00 | 30 | 0 | 0 | 0 |
| 29.04.2015 14:00 - 15:00 | 30 | 0 | 0 | 0 |
| 29.04.2015 15:00 - 16:00 | 30 | 0 | 0 | 0 |
| 29.04.2015 16:00 - 17:00 | 30 | 0 | 0 | 0 |
| 29.04.2015 17:00 - 18:00 | 30 | 0 | 0 | 0 |
| 29.04.2015 18:00 - 19:00 | 30 | 0 | 0 | 0 |
| 29.04.2015 19:00 - 20:00 | 30 | 0 | 0 | 0 |
| 29.04.2015 20:00 - 21:00 | 30 | 0 | 0 | 0 |
| 29.04.2015 21:00 - 22:00 | 30 | 0 | 0 | 0 |
| 29.04.2015 22:00 - 23:00 | 30 | 0 | 0 | 0 |
| 29.04.2015 23:00 - 24:00 | 30 | 0 | 0 | 0 |
| 30.04.2015 00:00 - 01:00 | 30 | 0 | 0 | 0 |
| 30.04.2015 01:00 - 02:00 | 30 | 0 | 0 | 0 |
| 30.04.2015 02:00 - 03:00 | 30 | 0 | 0 | 0 |
| 30.04.2015 03:00 - 04:00 | 30 | 0 | 0 | 0 |
| 30.04.2015 04:00 - 05:00 | 30 | 0 | 0 | 0 |
| 30.04.2015 05:00 - 06:00 | 30 | 0 | 0 | 0 |
| 30.04.2015 06:00 - 07:00 | 0 | 0 | 0 | 0 |
| 30.04.2015 07:00 - 08:00 | 0 | 0 | 0 | 0 |
| 30.04.2015 08:00 - 09:00 | 0 | 0 | 0 | 0 |
| 30.04.2015 09:00 - 10:00 | 0 | 0 | 0 | 0 |
| 30.04.2015 10:00 - 11:00 | 0 | 0 | 0 | 0 |
| 30.04.2015 11:00 - 12:00 | 0 | 0 | 0 | 0 |
| 30.04.2015 12:00 - 13:00 | 0 | 0 | 0 | 0 |
| 30.04.2015 13:00 - 14:00 | 0 | 0 | 0 | 0 |
| 30.04.2015 14:00 - 15:00 | 0 | 0 | 0 | 0 |
| 30.04.2015 15:00 - 16:00 | 0 | 0 | 0 | 0 |
| 30.04.2015 16:00 - 17:00 | 0 | 0 | 0 | 0 |
| 30.04.2015 17:00 - 18:00 | 0 | 0 | 0 | 0 |
| 30.04.2015 18:00 - 19:00 | 0 | 0 | 0 | 0 |
| 30.04.2015 19:00 - 20:00 | 0 | 0 | 0 | 0 |
| 30.04.2015 20:00 - 21:00 | 0 | 0 | 0 | 0 |
| 30.04.2015 21:00 - 22:00 | 0 | 0 | 0 | 0 |
| 30.04.2015 22:00 - 23:00 | 0 | 0 | 0 | 0 |
| 30.04.2015 23:00 - 24:00 | 0 | 0 | 0 | 0 |
| 01.05.2015 00:00 - 01:00 | 0 | 0 | 0 | 0 |
| 01.05.2015 01:00 - 02:00 | 0 | 0 | 0 | 0 |
| 01.05.2015 02:00 - 03:00 | 0 | 0 | 0 | 0 |
| 01.05.2015 03:00 - 04:00 | 0 | 0 | 0 | 0 |
| 01.05.2015 04:00 - 05:00 | 0 | 0 | 0 | 0 |